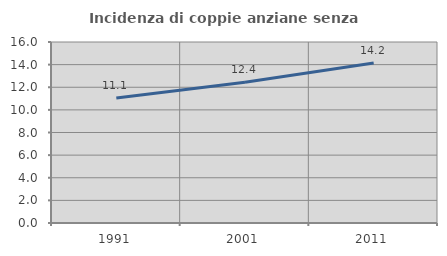
| Category | Incidenza di coppie anziane senza figli  |
|---|---|
| 1991.0 | 11.059 |
| 2001.0 | 12.442 |
| 2011.0 | 14.151 |